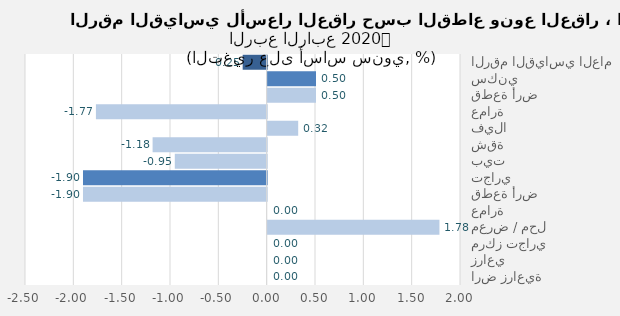
| Category | Series 0 |
|---|---|
| الرقم القياسي العام | -0.248 |
| سكني | 0.5 |
| قطعة أرض | 0.5 |
| عمارة | -1.766 |
| فيلا | 0.316 |
| شقة | -1.18 |
| بيت | -0.95 |
| تجاري | -1.9 |
| قطعة أرض | -1.9 |
| عمارة | 0 |
| معرض / محل | 1.777 |
| مركز تجاري | 0 |
| زراعي | 0 |
| ارض زراعية | 0 |